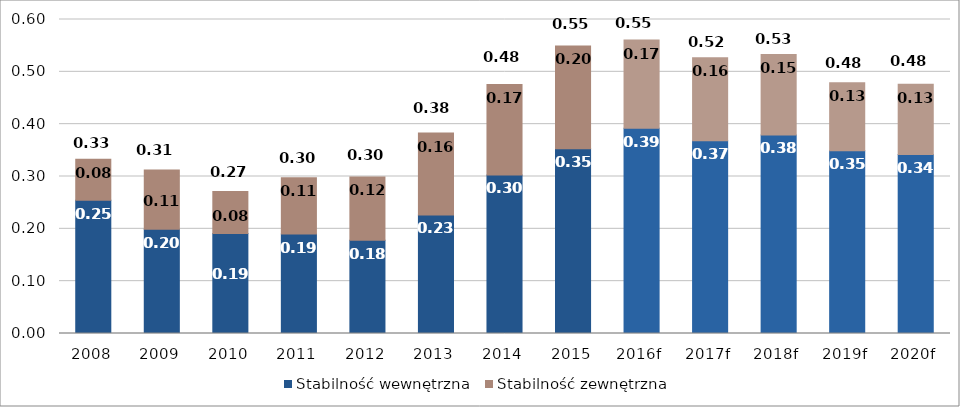
| Category | Stabilność wewnętrzna | Stabilność zewnętrzna |
|---|---|---|
| 2008 | 0.255 | 0.078 |
| 2009 | 0.199 | 0.113 |
| 2010 | 0.191 | 0.08 |
| 2011 | 0.19 | 0.107 |
| 2012 | 0.178 | 0.121 |
| 2013 | 0.227 | 0.156 |
| 2014 | 0.303 | 0.173 |
| 2015 | 0.353 | 0.196 |
| 2016f | 0.392 | 0.169 |
| 2017f | 0.369 | 0.158 |
| 2018f | 0.38 | 0.154 |
| 2019f | 0.349 | 0.13 |
| 2020f | 0.342 | 0.134 |